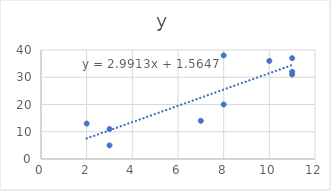
| Category | y |
|---|---|
| 2.0 | 13 |
| 3.0 | 5 |
| 7.0 | 14 |
| 8.0 | 20 |
| 3.0 | 11 |
| 10.0 | 36 |
| 8.0 | 38 |
| 11.0 | 31 |
| 11.0 | 32 |
| 11.0 | 37 |